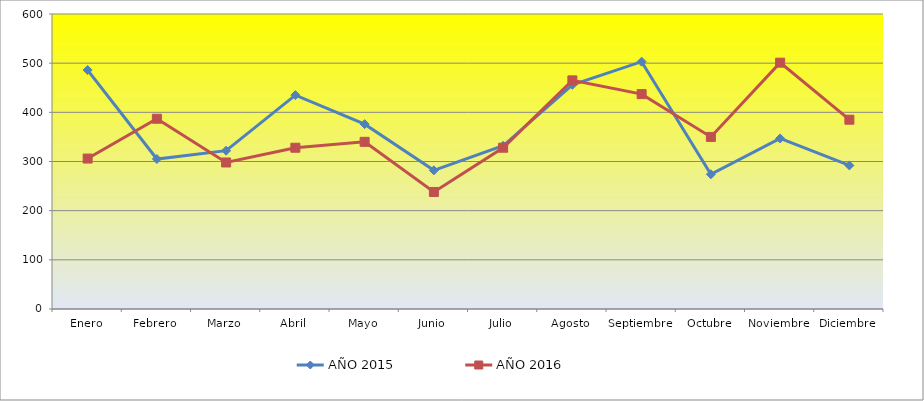
| Category | AÑO 2015 | AÑO 2016 |
|---|---|---|
| Enero | 486 | 306 |
| Febrero | 305 | 387 |
| Marzo | 322 | 298 |
| Abril | 435 | 328 |
| Mayo | 376 | 340 |
| Junio | 282 | 238 |
| Julio | 332 | 328 |
| Agosto | 456 | 465 |
| Septiembre | 503 | 437 |
| Octubre | 274 | 350 |
| Noviembre | 347 | 501 |
| Diciembre | 292 | 385 |